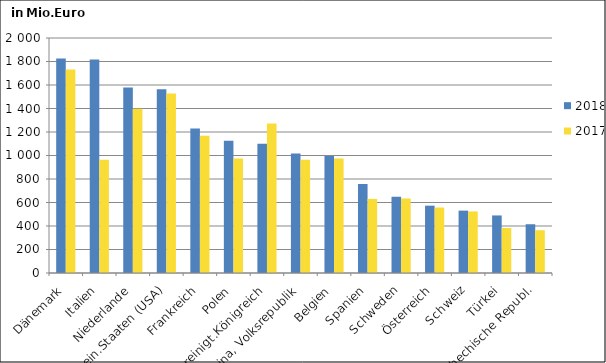
| Category | 2018 | 2017 |
|---|---|---|
| Dänemark | 1824.846 | 1730.942 |
| Italien | 1817.102 | 964.798 |
| Niederlande | 1577.837 | 1398.534 |
| Verein.Staaten (USA) | 1563.235 | 1526.78 |
| Frankreich | 1230.561 | 1167.847 |
| Polen | 1125.97 | 973.748 |
| Vereinigt.Königreich | 1100.637 | 1272.567 |
| China, Volksrepublik | 1017.694 | 964.71 |
| Belgien | 996.673 | 974.138 |
| Spanien | 756.889 | 630.722 |
| Schweden | 648.996 | 633.967 |
| Österreich | 573.011 | 557.263 |
| Schweiz | 530.867 | 524.1 |
| Türkei | 489.857 | 383.203 |
| Tschechische Republ. | 415.049 | 363.984 |